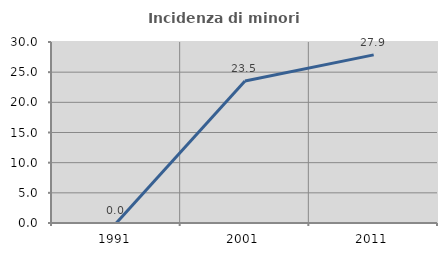
| Category | Incidenza di minori stranieri |
|---|---|
| 1991.0 | 0 |
| 2001.0 | 23.529 |
| 2011.0 | 27.869 |